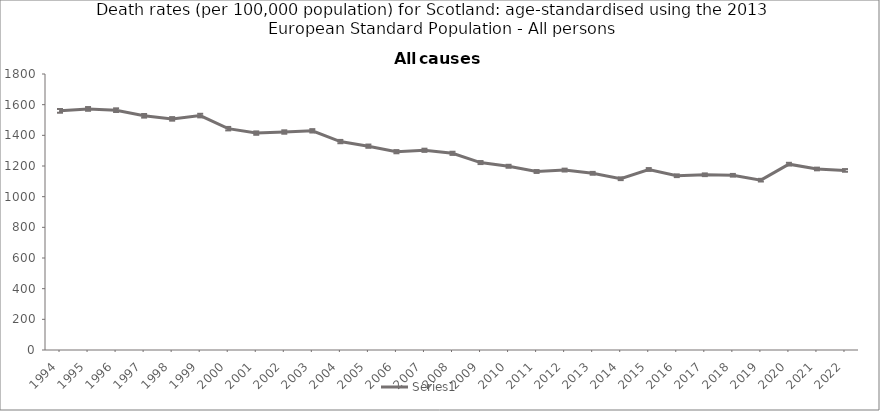
| Category | Series 0 |
|---|---|
| 1994.0 | 1559.6 |
| 1995.0 | 1572.3 |
| 1996.0 | 1564.1 |
| 1997.0 | 1527.4 |
| 1998.0 | 1507.3 |
| 1999.0 | 1528.8 |
| 2000.0 | 1443.5 |
| 2001.0 | 1414.6 |
| 2002.0 | 1421.6 |
| 2003.0 | 1429.4 |
| 2004.0 | 1359.3 |
| 2005.0 | 1329.3 |
| 2006.0 | 1293.4 |
| 2007.0 | 1302.5 |
| 2008.0 | 1282.7 |
| 2009.0 | 1222.5 |
| 2010.0 | 1198.2 |
| 2011.0 | 1164.2 |
| 2012.0 | 1173.4 |
| 2013.0 | 1152.3 |
| 2014.0 | 1116.9 |
| 2015.0 | 1177.3 |
| 2016.0 | 1136.4 |
| 2017.0 | 1142.9 |
| 2018.0 | 1139.5 |
| 2019.0 | 1107.6 |
| 2020.0 | 1212 |
| 2021.0 | 1180.6 |
| 2022.0 | 1171.2 |